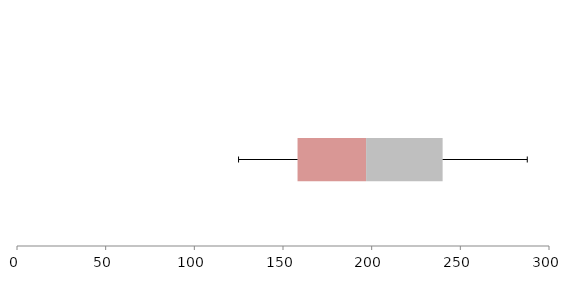
| Category | Series 1 | Series 2 | Series 3 |
|---|---|---|---|
| 0 | 158.202 | 38.665 | 43.145 |